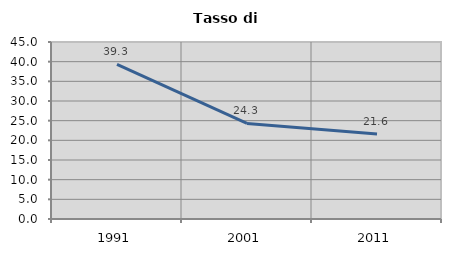
| Category | Tasso di disoccupazione   |
|---|---|
| 1991.0 | 39.306 |
| 2001.0 | 24.307 |
| 2011.0 | 21.612 |